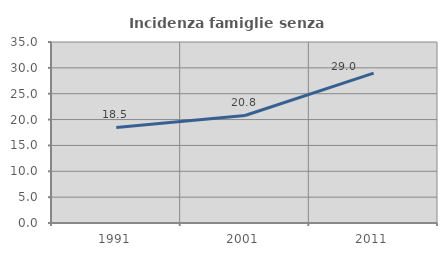
| Category | Incidenza famiglie senza nuclei |
|---|---|
| 1991.0 | 18.478 |
| 2001.0 | 20.792 |
| 2011.0 | 28.982 |